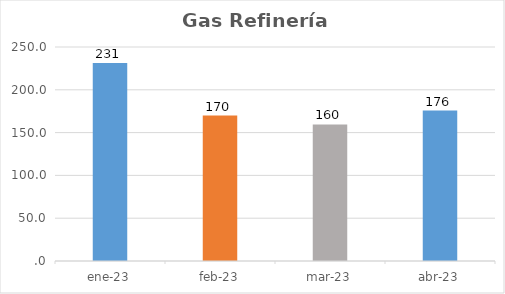
| Category | Gas Refinería |
|---|---|
| ene-23 | 231.304 |
| feb-23 | 169.926 |
| mar-23 | 159.546 |
| abr-23 | 175.762 |